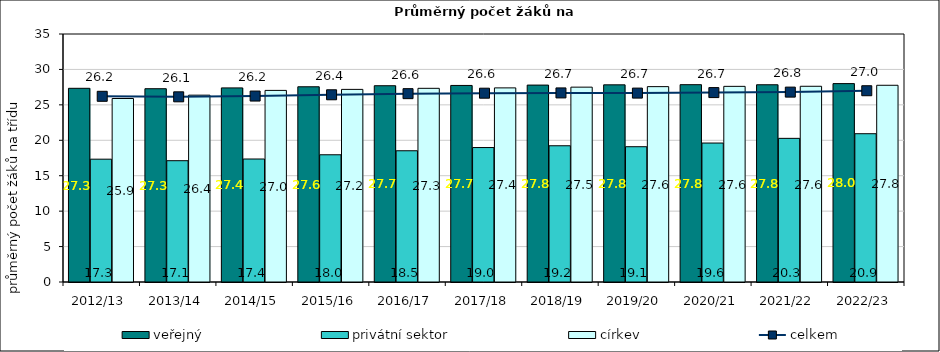
| Category | veřejný | privátní sektor | církev |
|---|---|---|---|
| 2012/13 | 27.337 | 17.332 | 25.896 |
| 2013/14 | 27.28 | 17.121 | 26.367 |
| 2014/15 | 27.392 | 17.358 | 27.041 |
| 2015/16 | 27.552 | 17.956 | 27.184 |
| 2016/17 | 27.7 | 18.521 | 27.333 |
| 2017/18 | 27.741 | 18.975 | 27.395 |
| 2018/19 | 27.789 | 19.228 | 27.5 |
| 2019/20 | 27.826 | 19.093 | 27.572 |
| 2020/21 | 27.848 | 19.612 | 27.612 |
| 2021/22 | 27.837 | 20.274 | 27.622 |
| 2022/23 | 27.997 | 20.928 | 27.763 |